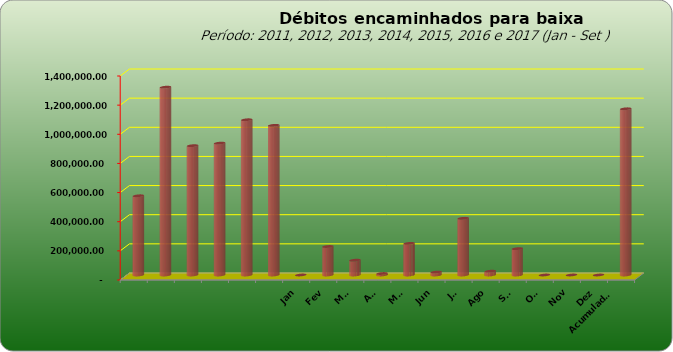
| Category |  543.796,20  |
|---|---|
|  | 543796.2 |
|  | 1289053.69 |
|  | 887573.08 |
|  | 905052.31 |
|  | 1065434.28 |
|  | 1027209.41 |
| Jan | 0 |
| Fev | 195564.55 |
| Mar | 101757.11 |
| Abr | 10195.55 |
| Mai | 217067.29 |
| Jun | 19848.93 |
| Jul | 389298.76 |
| Ago | 26234.02 |
| Set | 180838.97 |
| Out | 0 |
| Nov | 0 |
| Dez | 0 |
| Acumulado
2016 | 1140805.18 |